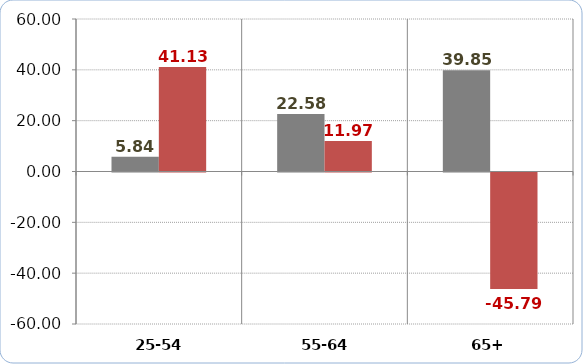
| Category | Real Income (07-15 percentage change) | People in Relative Poverty (07-15 percentage change) |
|---|---|---|
| 25-54 | 5.842 | 41.129 |
| 55-64 | 22.583 | 11.966 |
| 65+ | 39.847 | -45.793 |